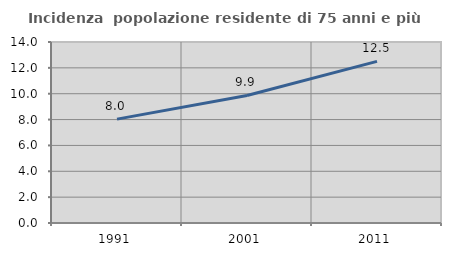
| Category | Incidenza  popolazione residente di 75 anni e più |
|---|---|
| 1991.0 | 8.033 |
| 2001.0 | 9.863 |
| 2011.0 | 12.5 |